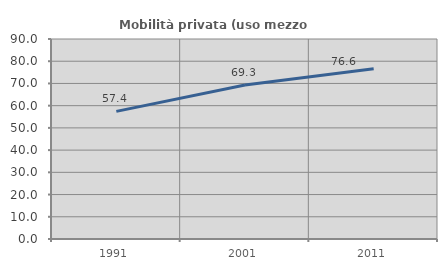
| Category | Mobilità privata (uso mezzo privato) |
|---|---|
| 1991.0 | 57.429 |
| 2001.0 | 69.298 |
| 2011.0 | 76.639 |